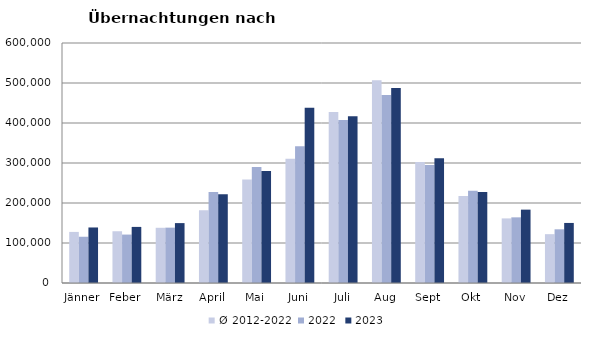
| Category | Ø 2012-2022 | 2022 | 2023 |
|---|---|---|---|
| Jänner | 127704 | 115620 | 138816 |
| Feber | 129389.636 | 121086 | 140234 |
| März | 138017.909 | 138364 | 149745 |
| April | 181872 | 227240 | 221850 |
| Mai | 258656.818 | 290079 | 280173 |
| Juni | 310409.273 | 341645 | 438324 |
| Juli | 427498.727 | 407558 | 417126 |
| Aug | 506681.636 | 470298 | 487313 |
| Sept | 302430.545 | 294755 | 311564 |
| Okt | 217801.091 | 230442 | 227566 |
| Nov | 161466.727 | 164130 | 183404 |
| Dez | 122087.909 | 134236 | 150129 |